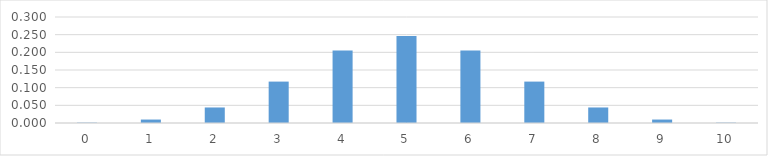
| Category | Series 0 |
|---|---|
| 0.0 | 0.001 |
| 1.0 | 0.01 |
| 2.0 | 0.044 |
| 3.0 | 0.117 |
| 4.0 | 0.205 |
| 5.0 | 0.246 |
| 6.0 | 0.205 |
| 7.0 | 0.117 |
| 8.0 | 0.044 |
| 9.0 | 0.01 |
| 10.0 | 0.001 |